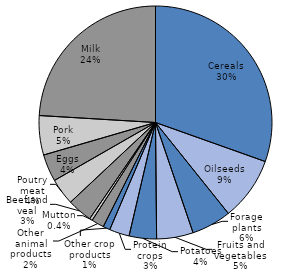
| Category | Series 0 |
|---|---|
| Cereals | 0.304 |
| Oilseeds | 0.088 |
| Forage plants | 0.055 |
| Fruits and vegetables | 0.051 |
| Potatoes | 0.038 |
| Protein crops | 0.028 |
| Other crop products | 0.01 |
| Other animal products | 0.017 |
| Mutton | 0.004 |
| Beef and veal | 0.035 |
| Poutry meat | 0.037 |
| Eggs | 0.038 |
| Pork | 0.055 |
| Milk | 0.24 |